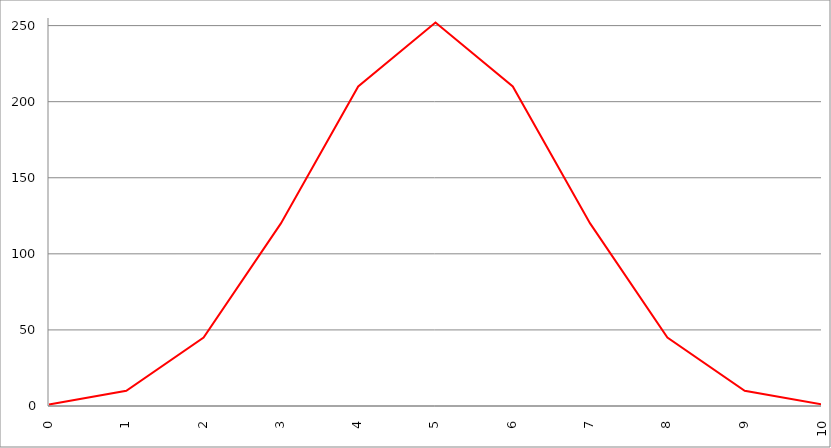
| Category | Series 1 |
|---|---|
| 0.0 | 1 |
| 1.0 | 10 |
| 2.0 | 45 |
| 3.0 | 120 |
| 4.0 | 210 |
| 5.0 | 252 |
| 6.0 | 210 |
| 7.0 | 120 |
| 8.0 | 45 |
| 9.0 | 10 |
| 10.0 | 1 |